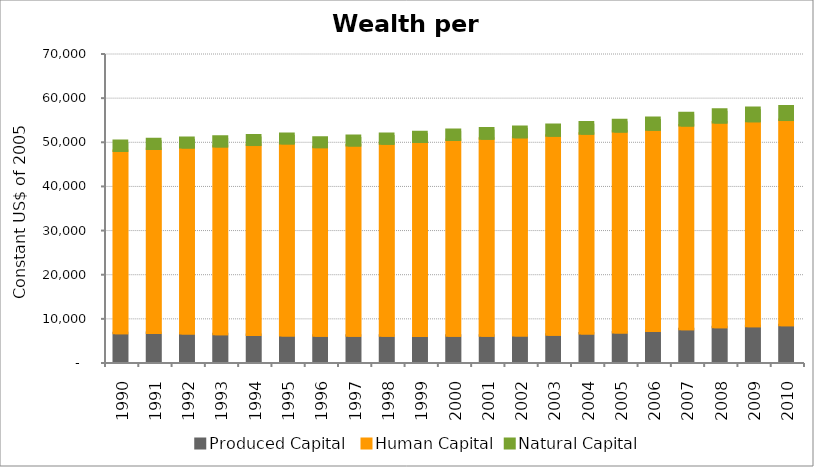
| Category | Produced Capital  | Human Capital | Natural Capital |
|---|---|---|---|
| 1990.0 | 6533.913 | 41283.373 | 2226.627 |
| 1991.0 | 6560.1 | 41688.4 | 2213.072 |
| 1992.0 | 6463.815 | 42111.679 | 2194.485 |
| 1993.0 | 6289.491 | 42549.874 | 2175.307 |
| 1994.0 | 6140.362 | 43007.592 | 2161.154 |
| 1995.0 | 6031.496 | 43490.756 | 2155.67 |
| 1996.0 | 5960.738 | 42706.915 | 2159.795 |
| 1997.0 | 5931.426 | 43108.942 | 2172.167 |
| 1998.0 | 5918.462 | 43524.463 | 2191.155 |
| 1999.0 | 5907.927 | 43942.028 | 2214.08 |
| 2000.0 | 5946.4 | 44350.201 | 2238.758 |
| 2001.0 | 5960.29 | 44622.154 | 2301.412 |
| 2002.0 | 6024.966 | 44862.929 | 2366.417 |
| 2003.0 | 6193.074 | 45081.469 | 2432.162 |
| 2004.0 | 6442.993 | 45291.236 | 2496.466 |
| 2005.0 | 6696.699 | 45494.902 | 2557.57 |
| 2006.0 | 7010.33 | 45598.426 | 2669.564 |
| 2007.0 | 7432.45 | 46128.927 | 2777.081 |
| 2008.0 | 7852.684 | 46382.246 | 2881.374 |
| 2009.0 | 8085.168 | 46443.95 | 2984.97 |
| 2010.0 | 8316.573 | 46498.071 | 3090.014 |